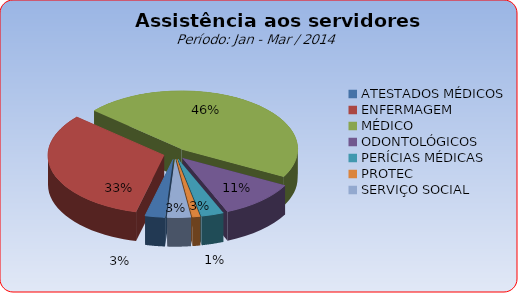
| Category | Series 0 |
|---|---|
| ATESTADOS MÉDICOS | 2.776 |
| ENFERMAGEM | 32.571 |
| MÉDICO | 46.367 |
| ODONTOLÓGICOS | 10.857 |
| PERÍCIAS MÉDICAS | 3.102 |
| PROTEC | 1.061 |
| SERVIÇO SOCIAL | 3.265 |